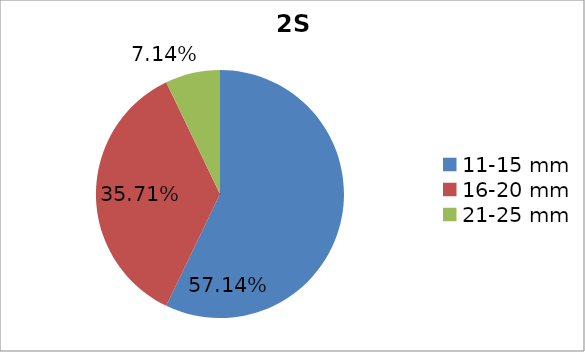
| Category | Series 0 |
|---|---|
| 11-15 mm | 0.571 |
| 16-20 mm | 0.357 |
| 21-25 mm | 0.071 |